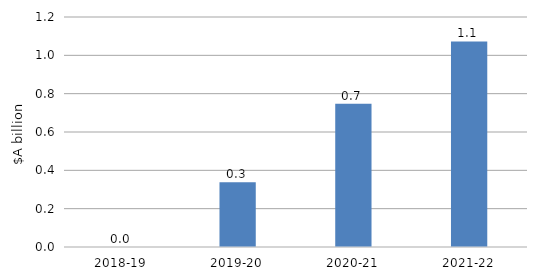
| Category | Labour for aid (in billions) |
|---|---|
| 2018-19 | 0 |
| 2019-20 | 0.338 |
| 2020-21 | 0.747 |
| 2021-22 | 1.072 |